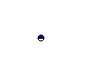
| Category | Series 0 |
|---|---|
| 0 | 53843 |
| 1 | 56449 |